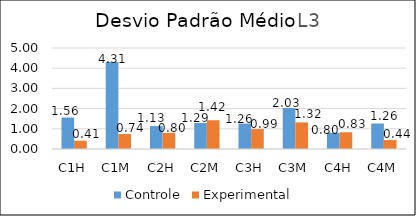
| Category | Controle | Experimental  |
|---|---|---|
| C1H | 1.558 | 0.412 |
| C1M | 4.308 | 0.739 |
| C2H | 1.134 | 0.801 |
| C2M | 1.289 | 1.423 |
| C3H | 1.26 | 0.986 |
| C3M | 2.03 | 1.316 |
| C4H | 0.801 | 0.828 |
| C4M | 1.262 | 0.443 |